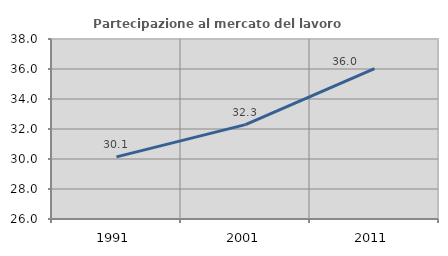
| Category | Partecipazione al mercato del lavoro  femminile |
|---|---|
| 1991.0 | 30.144 |
| 2001.0 | 32.291 |
| 2011.0 | 36.033 |